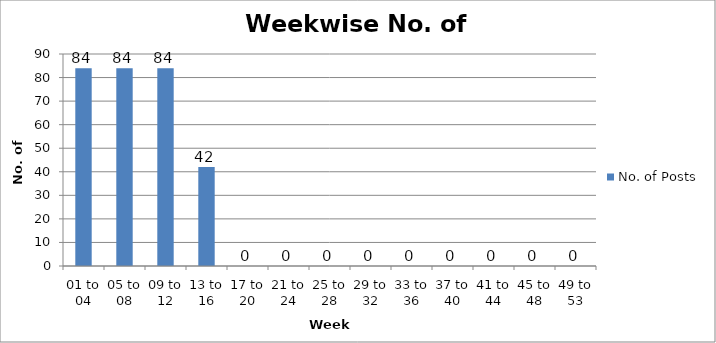
| Category | No. of Posts |
|---|---|
| 01 to 04 | 84 |
| 05 to 08 | 84 |
| 09 to 12 | 84 |
| 13 to 16 | 42 |
| 17 to 20 | 0 |
| 21 to 24 | 0 |
| 25 to 28 | 0 |
| 29 to 32 | 0 |
| 33 to 36 | 0 |
| 37 to 40 | 0 |
| 41 to 44 | 0 |
| 45 to 48 | 0 |
| 49 to 53 | 0 |